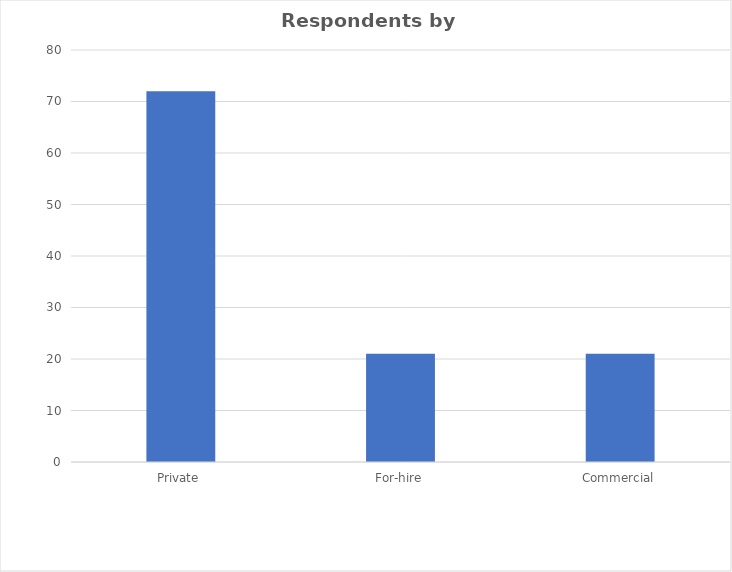
| Category | Series 0 |
|---|---|
| Private | 72 |
| For-hire | 21 |
| Commercial | 21 |